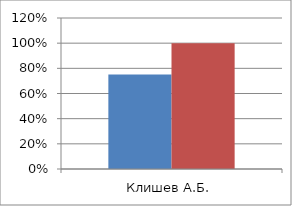
| Category | Series 0 | 2 |
|---|---|---|
| Клишев А.Б. | 0.752 | 1 |